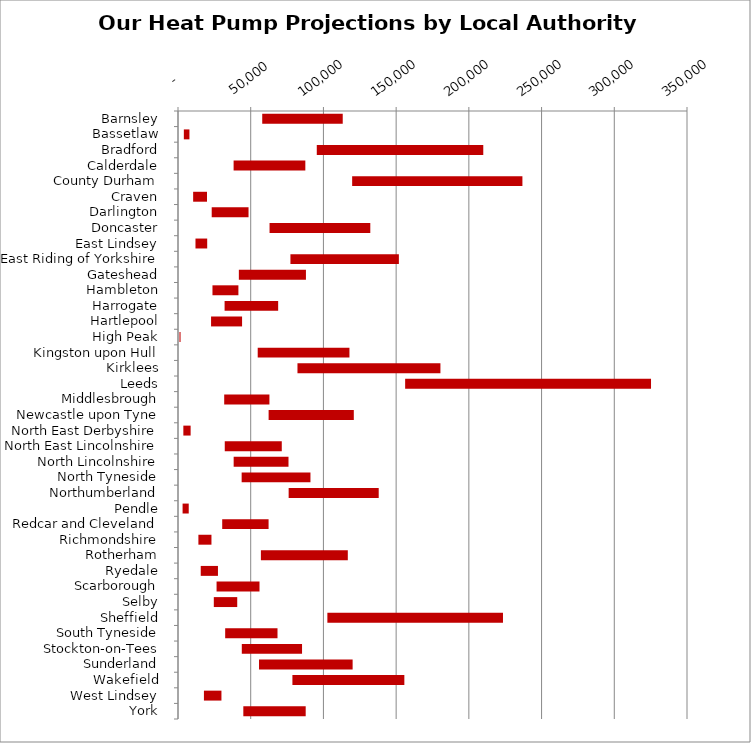
| Category | MIN | MAX |
|---|---|---|
| Barnsley | 57920 | 55355 |
| Bassetlaw | 4014 | 3847 |
| Bradford | 95429 | 114484 |
| Calderdale | 38237 | 49322 |
| County Durham | 119755 | 117071 |
| Craven | 10414 | 9548 |
| Darlington | 23177 | 25326 |
| Doncaster | 62957 | 69271 |
| East Lindsey | 12021 | 8056 |
| East Riding of Yorkshire | 77310 | 74564 |
| Gateshead | 41841 | 46130 |
| Hambleton | 23702 | 17832 |
| Harrogate | 32040 | 36831 |
| Hartlepool | 22734 | 21327 |
| High Peak | 1016 | 728 |
| Kingston upon Hull | 54812 | 63078 |
| Kirklees | 82151 | 98301 |
| Leeds | 156194 | 169065 |
| Middlesbrough | 31771 | 31095 |
| Newcastle upon Tyne | 62313 | 58573 |
| North East Derbyshire | 3676 | 5006 |
| North East Lincolnshire | 32156 | 39203 |
| North Lincolnshire | 38275 | 37703 |
| North Tyneside | 43768 | 47310 |
| Northumberland | 76087 | 61925 |
| Pendle | 3154 | 4222 |
| Redcar and Cleveland | 30400 | 31886 |
| Richmondshire | 14025 | 8981 |
| Rotherham | 57001 | 59763 |
| Ryedale | 15634 | 11842 |
| Scarborough | 26522 | 29520 |
| Selby | 24620 | 16107 |
| Sheffield | 102716 | 120746 |
| South Tyneside | 32440 | 35979 |
| Stockton-on-Tees | 43870 | 41425 |
| Sunderland | 55710 | 64367 |
| Wakefield | 78672 | 76970 |
| West Lindsey | 17826 | 12046 |
| York | 44919 | 42885 |